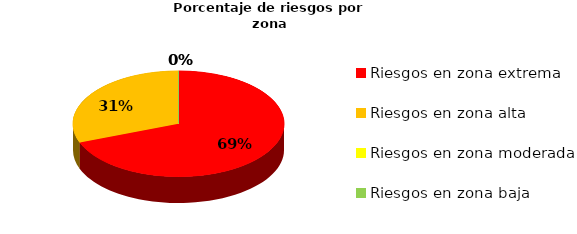
| Category | Series 0 | Series 1 |
|---|---|---|
| Riesgos en zona extrema | 9 | 0.692 |
| Riesgos en zona alta | 4 | 0.308 |
| Riesgos en zona moderada | 0 | 0 |
| Riesgos en zona baja | 0 | 0 |